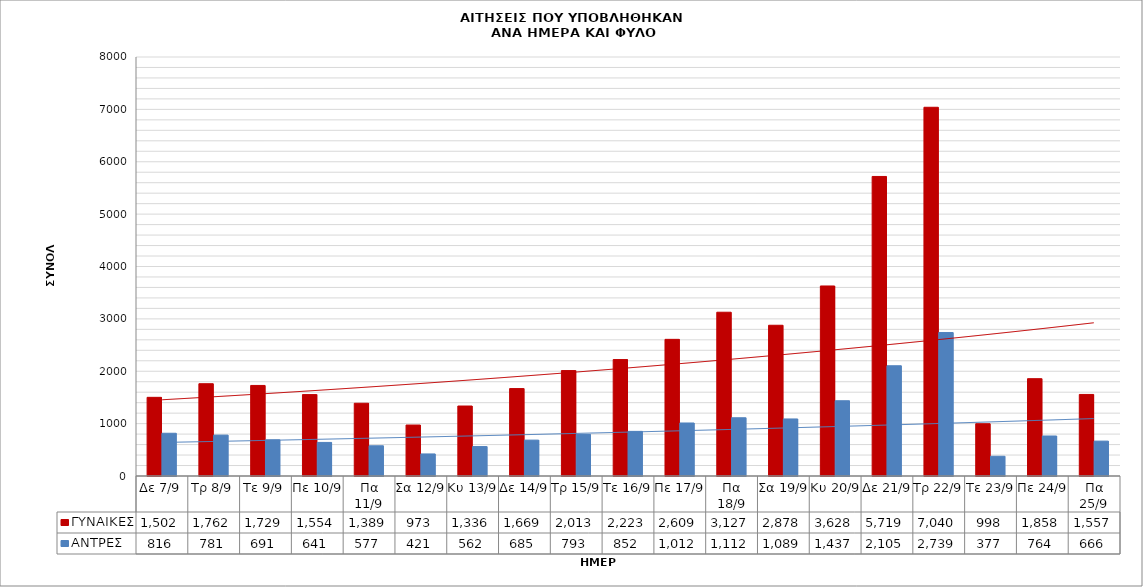
| Category | ΓΥΝΑΙΚΕΣ | ΑΝΤΡΕΣ |
|---|---|---|
| Δε 7/9 | 1502 | 816 |
| Τρ 8/9 | 1762 | 781 |
| Τε 9/9 | 1729 | 691 |
| Πε 10/9 | 1554 | 641 |
| Πα 11/9 | 1389 | 577 |
| Σα 12/9 | 973 | 421 |
| Κυ 13/9 | 1336 | 562 |
| Δε 14/9 | 1669 | 685 |
| Τρ 15/9 | 2013 | 793 |
| Τε 16/9 | 2223 | 852 |
| Πε 17/9 | 2609 | 1012 |
| Πα 18/9 | 3127 | 1112 |
| Σα 19/9 | 2878 | 1089 |
| Κυ 20/9 | 3628 | 1437 |
| Δε 21/9 | 5719 | 2105 |
| Τρ 22/9 | 7040 | 2739 |
| Τε 23/9 | 998 | 377 |
| Πε 24/9 | 1858 | 764 |
| Πα 25/9 | 1557 | 666 |